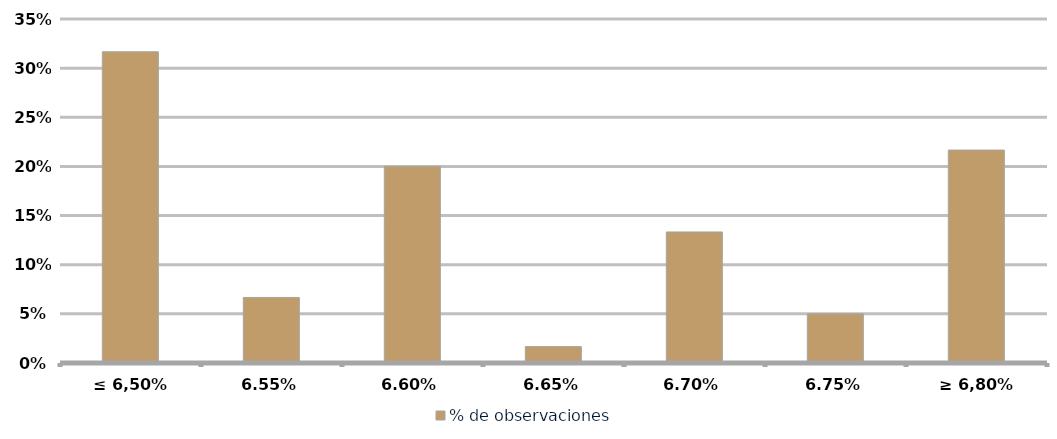
| Category | % de observaciones  |
|---|---|
| ≤ 6,50% | 0.317 |
| 6,55% | 0.067 |
| 6,60% | 0.2 |
| 6,65% | 0.017 |
| 6,70% | 0.133 |
| 6,75% | 0.05 |
| ≥ 6,80% | 0.217 |